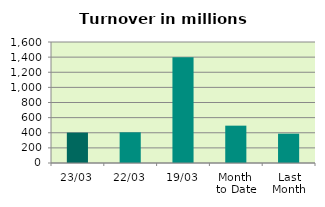
| Category | Series 0 |
|---|---|
| 23/03 | 402.091 |
| 22/03 | 405.718 |
| 19/03 | 1399.945 |
| Month 
to Date | 493.727 |
| Last
Month | 387.65 |